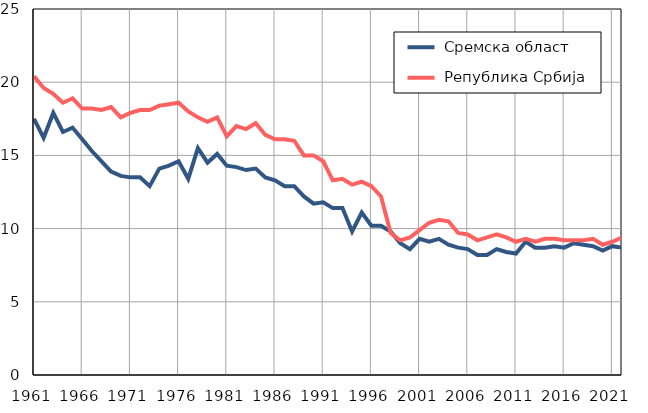
| Category |  Сремска област |  Република Србија |
|---|---|---|
| 1961.0 | 17.5 | 20.4 |
| 1962.0 | 16.2 | 19.6 |
| 1963.0 | 17.9 | 19.2 |
| 1964.0 | 16.6 | 18.6 |
| 1965.0 | 16.9 | 18.9 |
| 1966.0 | 16.1 | 18.2 |
| 1967.0 | 15.3 | 18.2 |
| 1968.0 | 14.6 | 18.1 |
| 1969.0 | 13.9 | 18.3 |
| 1970.0 | 13.6 | 17.6 |
| 1971.0 | 13.5 | 17.9 |
| 1972.0 | 13.5 | 18.1 |
| 1973.0 | 12.9 | 18.1 |
| 1974.0 | 14.1 | 18.4 |
| 1975.0 | 14.3 | 18.5 |
| 1976.0 | 14.6 | 18.6 |
| 1977.0 | 13.4 | 18 |
| 1978.0 | 15.5 | 17.6 |
| 1979.0 | 14.5 | 17.3 |
| 1980.0 | 15.1 | 17.6 |
| 1981.0 | 14.3 | 16.3 |
| 1982.0 | 14.2 | 17 |
| 1983.0 | 14 | 16.8 |
| 1984.0 | 14.1 | 17.2 |
| 1985.0 | 13.5 | 16.4 |
| 1986.0 | 13.3 | 16.1 |
| 1987.0 | 12.9 | 16.1 |
| 1988.0 | 12.9 | 16 |
| 1989.0 | 12.2 | 15 |
| 1990.0 | 11.7 | 15 |
| 1991.0 | 11.8 | 14.6 |
| 1992.0 | 11.4 | 13.3 |
| 1993.0 | 11.4 | 13.4 |
| 1994.0 | 9.8 | 13 |
| 1995.0 | 11.1 | 13.2 |
| 1996.0 | 10.2 | 12.9 |
| 1997.0 | 10.2 | 12.2 |
| 1998.0 | 9.8 | 9.7 |
| 1999.0 | 9 | 9.2 |
| 2000.0 | 8.6 | 9.4 |
| 2001.0 | 9.3 | 9.9 |
| 2002.0 | 9.1 | 10.4 |
| 2003.0 | 9.3 | 10.6 |
| 2004.0 | 8.9 | 10.5 |
| 2005.0 | 8.7 | 9.7 |
| 2006.0 | 8.6 | 9.6 |
| 2007.0 | 8.2 | 9.2 |
| 2008.0 | 8.2 | 9.4 |
| 2009.0 | 8.6 | 9.6 |
| 2010.0 | 8.4 | 9.4 |
| 2011.0 | 8.3 | 9.1 |
| 2012.0 | 9.1 | 9.3 |
| 2013.0 | 8.7 | 9.1 |
| 2014.0 | 8.7 | 9.3 |
| 2015.0 | 8.8 | 9.3 |
| 2016.0 | 8.7 | 9.2 |
| 2017.0 | 9 | 9.2 |
| 2018.0 | 8.9 | 9.2 |
| 2019.0 | 8.8 | 9.3 |
| 2020.0 | 8.5 | 8.9 |
| 2021.0 | 8.8 | 9.1 |
| 2022.0 | 8.7 | 9.4 |